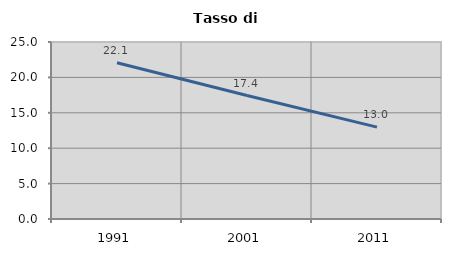
| Category | Tasso di disoccupazione   |
|---|---|
| 1991.0 | 22.059 |
| 2001.0 | 17.437 |
| 2011.0 | 12.973 |